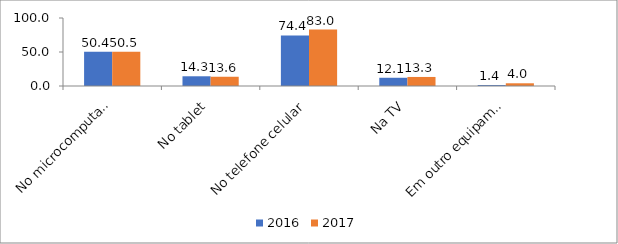
| Category | 2016 | 2017 |
|---|---|---|
| No microcomputador | 50.4 | 50.5 |
| No tablet | 14.3 | 13.6 |
| No telefone celular | 74.4 | 83 |
| Na TV | 12.1 | 13.3 |
| Em outro equipamento | 1.4 | 4 |